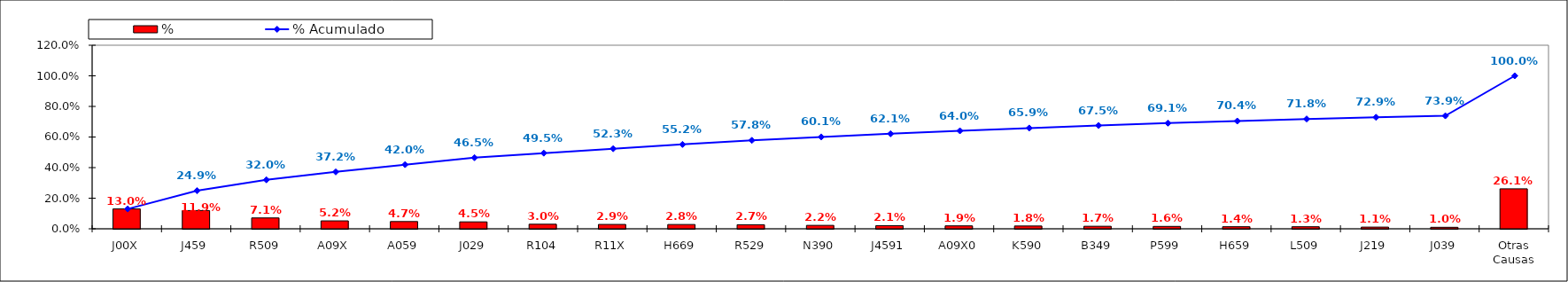
| Category | % |
|---|---|
| J00X | 0.13 |
| J459 | 0.119 |
| R509 | 0.071 |
| A09X | 0.052 |
| A059 | 0.047 |
| J029 | 0.045 |
| R104 | 0.03 |
| R11X | 0.029 |
| H669 | 0.028 |
| R529 | 0.027 |
| N390 | 0.022 |
| J4591 | 0.021 |
| A09X0 | 0.019 |
| K590 | 0.018 |
| B349 | 0.017 |
| P599 | 0.016 |
| H659 | 0.014 |
| L509 | 0.013 |
| J219 | 0.011 |
| J039 | 0.01 |
| Otras Causas | 0.261 |